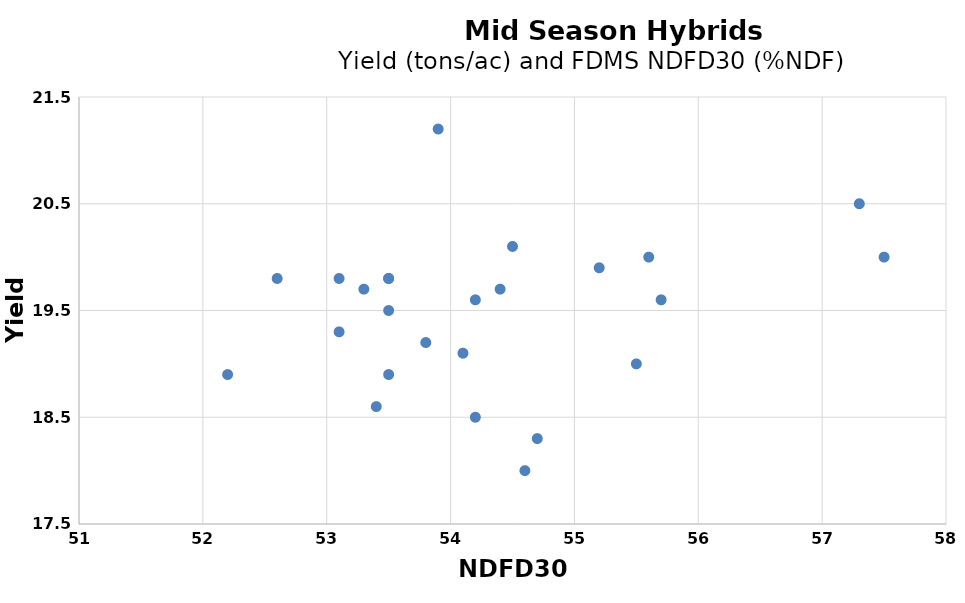
| Category | Series 0 |
|---|---|
| 54.1 | 19.1 |
| 54.6 | 18 |
| 52.6 | 19.8 |
| 55.5 | 19 |
| 53.8 | 19.2 |
| 52.2 | 18.9 |
| 53.5 | 18.9 |
| 54.5 | 20.1 |
| 55.7 | 19.6 |
| 57.3 | 20.5 |
| 53.9 | 21.2 |
| 53.1 | 19.3 |
| 55.6 | 20 |
| 54.2 | 19.6 |
| 53.3 | 19.7 |
| 53.5 | 19.8 |
| 53.4 | 18.6 |
| 54.2 | 18.5 |
| 53.5 | 19.8 |
| 53.1 | 19.8 |
| 53.5 | 19.5 |
| 54.4 | 19.7 |
| 55.2 | 19.9 |
| 57.5 | 20 |
| 54.7 | 18.3 |